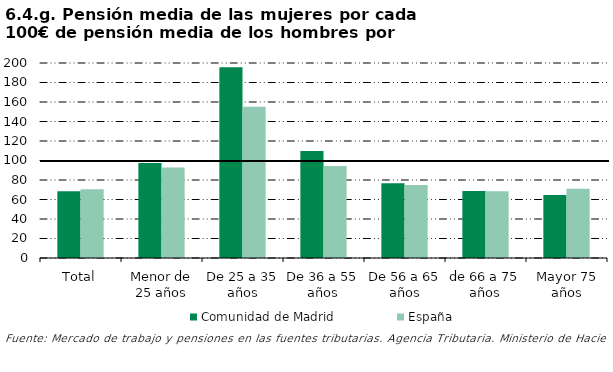
| Category | Comunidad de Madrid | España |
|---|---|---|
| Total | 68.505 | 70.502 |
| Menor de 25 años | 97.391 | 92.781 |
| De 25 a 35 años | 195.662 | 155.08 |
| De 36 a 55 años | 109.841 | 94.462 |
| De 56 a 65 años | 76.587 | 74.875 |
| de 66 a 75 años | 68.801 | 68.496 |
| Mayor 75 años | 64.663 | 70.943 |